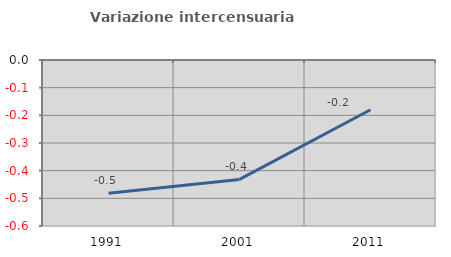
| Category | Variazione intercensuaria annua |
|---|---|
| 1991.0 | -0.481 |
| 2001.0 | -0.432 |
| 2011.0 | -0.18 |